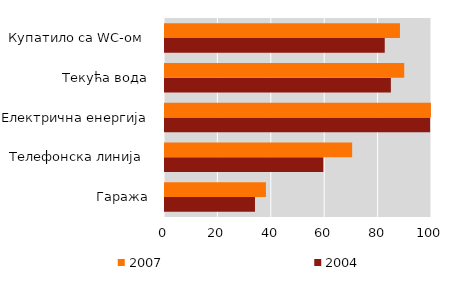
| Category | 2004 | 2007 |
|---|---|---|
| Гаража | 33.7 | 37.8 |
| Телефонска линија  | 59.3 | 70.1 |
| Електрична енергија | 99.3 | 99.6 |
| Текућа вода | 84.6 | 89.6 |
| Купатило са WC-ом  | 82.3 | 88 |